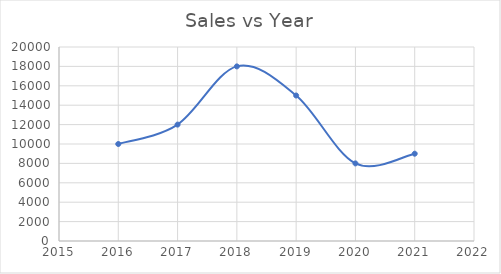
| Category | Series 0 |
|---|---|
| 2016.0 | 10000 |
| 2017.0 | 12000 |
| 2018.0 | 18000 |
| 2019.0 | 15000 |
| 2020.0 | 8000 |
| 2021.0 | 9000 |